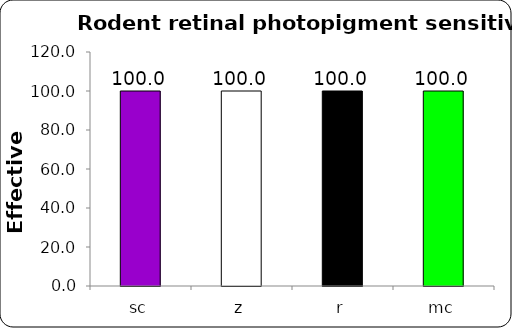
| Category | Series 0 |
|---|---|
| sc | 100 |
| z | 100 |
| r | 100 |
| mc | 100 |